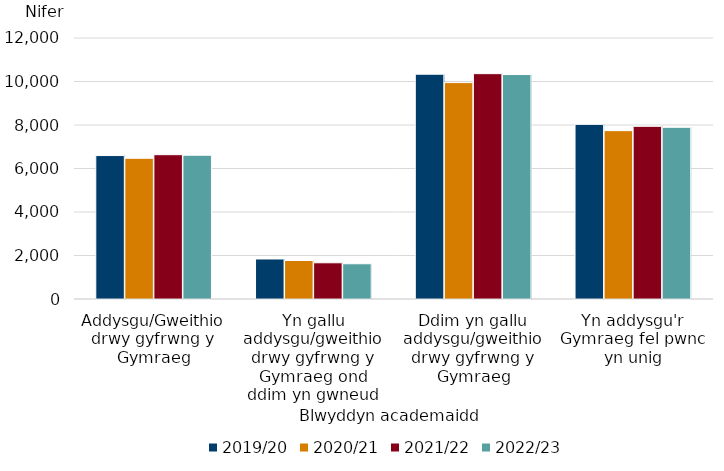
| Category | 2019/20 | 2020/21 | 2021/22 | 2022/23 |
|---|---|---|---|---|
| Addysgu/Gweithio drwy gyfrwng y Gymraeg | 6595 | 6470 | 6635 | 6610 |
| Yn gallu addysgu/gweithio drwy gyfrwng y Gymraeg ond ddim yn gwneud | 1840 | 1770 | 1665 | 1620 |
| Ddim yn gallu addysgu/gweithio drwy gyfrwng y Gymraeg | 10335 | 9950 | 10360 | 10320 |
| Yn addysgu'r Gymraeg fel pwnc yn unig | 8030 | 7740 | 7940 | 7895 |